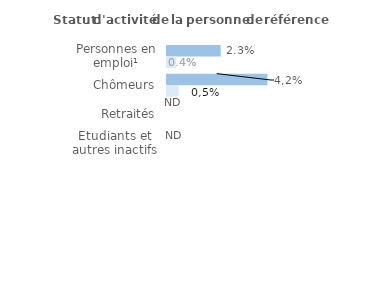
| Category | Series 1 | Series 0 |
|---|---|---|
| Personnes en emploi¹ | 0.023 | 0.004 |
| Chômeurs | 0.044 | 0.005 |
| Retraités | 0 | 0 |
| Etudiants et autres inactifs | 0 | 0 |